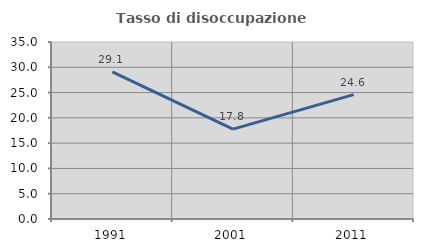
| Category | Tasso di disoccupazione giovanile  |
|---|---|
| 1991.0 | 29.104 |
| 2001.0 | 17.769 |
| 2011.0 | 24.59 |